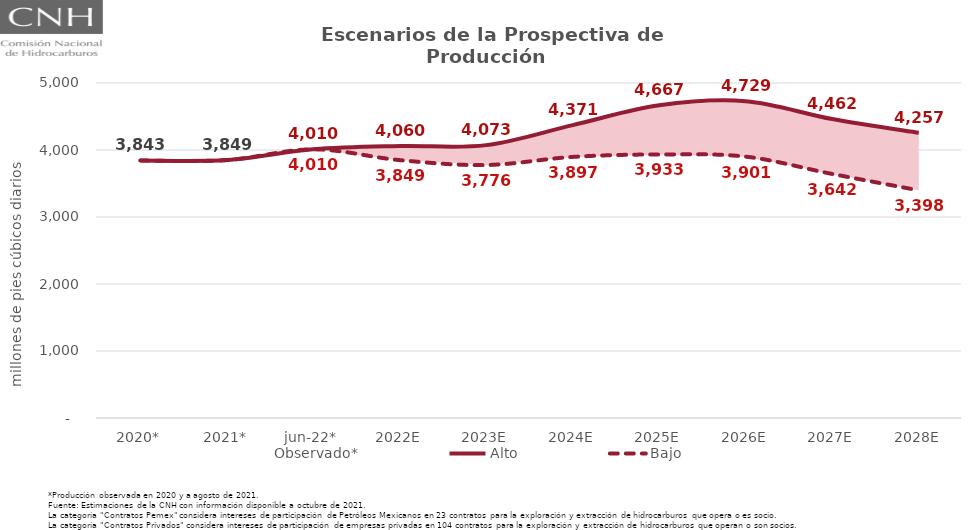
| Category | Observado* | Alto | Bajo |
|---|---|---|---|
| 2020* | 3843.295 | 3843.295 | 3843.295 |
| 2021* | 3849.2 | 3849.2 | 3849.2 |
| jun-22* | 4009.858 | 4009.858 | 4009.858 |
| 2022E | 4021.769 | 4059.517 | 3848.935 |
| 2023E | 3925.953 | 4072.67 | 3775.744 |
| 2024E | 4091.168 | 4371.261 | 3896.974 |
| 2025E | 4210.236 | 4666.682 | 3933.194 |
| 2026E | 4239.197 | 4728.504 | 3900.728 |
| 2027E | 3931.086 | 4461.611 | 3642.284 |
| 2028E | 3681.179 | 4256.501 | 3398.065 |